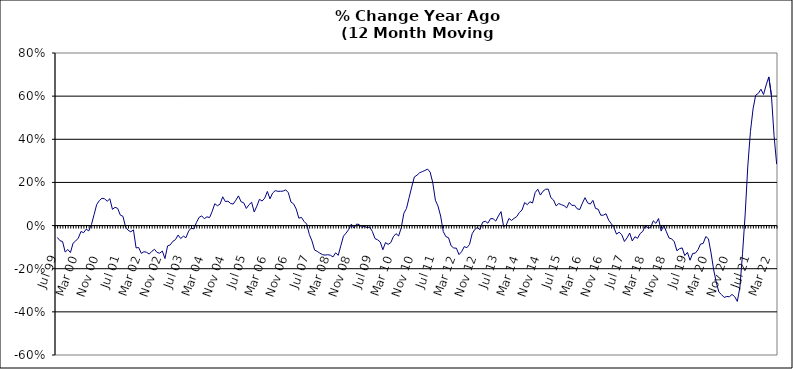
| Category | Series 0 |
|---|---|
| Jul 99 | -0.055 |
| Aug 99 | -0.07 |
| Sep 99 | -0.074 |
| Oct 99 | -0.123 |
| Nov 99 | -0.111 |
| Dec 99 | -0.125 |
| Jan 00 | -0.082 |
| Feb 00 | -0.071 |
| Mar 00 | -0.058 |
| Apr 00 | -0.027 |
| May 00 | -0.033 |
| Jun 00 | -0.017 |
| Jul 00 | -0.025 |
| Aug 00 | 0.005 |
| Sep 00 | 0.05 |
| Oct 00 | 0.098 |
| Nov 00 | 0.116 |
| Dec 00 | 0.127 |
| Jan 01 | 0.124 |
| Feb 01 | 0.113 |
| Mar 01 | 0.124 |
| Apr 01 | 0.075 |
| May 01 | 0.085 |
| Jun 01 | 0.08 |
| Jul 01 | 0.048 |
| Aug 01 | 0.043 |
| Sep 01 | -0.007 |
| Oct 01 | -0.022 |
| Nov 01 | -0.029 |
| Dec 01 | -0.02 |
| Jan 02 | -0.103 |
| Feb 02 | -0.102 |
| Mar 02 | -0.129 |
| Apr 02 | -0.121 |
| May 02 | -0.124 |
| Jun 02 | -0.132 |
| Jul 02 | -0.119 |
| Aug 02 | -0.11 |
| Sep 02 | -0.125 |
| Oct 02 | -0.128 |
| Nov 02 | -0.118 |
| Dec 02 | -0.153 |
| Jan 03 | -0.094 |
| Feb 03 | -0.09 |
| Mar 03 | -0.073 |
| Apr 03 | -0.065 |
| May 03 | -0.044 |
| Jun 03 | -0.06 |
| Jul 03 | -0.049 |
| Aug 03 | -0.056 |
| Sep 03 | -0.026 |
| Oct 03 | -0.012 |
| Nov 03 | -0.016 |
| Dec 03 | 0.014 |
| Jan 04 | 0.038 |
| Feb 04 | 0.045 |
| Mar 04 | 0.032 |
| Apr 04 | 0.041 |
| May 04 | 0.037 |
| Jun 04 | 0.066 |
| Jul 04 | 0.101 |
| Aug 04 | 0.092 |
| Sep 04 | 0.1 |
| Oct 04 | 0.133 |
| Nov 04 | 0.111 |
| Dec 04 | 0.113 |
| Jan 05 | 0.103 |
| Feb 05 | 0.1 |
| Mar 05 | 0.118 |
| Apr 05 | 0.138 |
| May 05 | 0.11 |
| Jun 05 | 0.106 |
| Jul 05 | 0.079 |
| Aug 05 | 0.097 |
| Sep 05 | 0.108 |
| Oct 05 | 0.063 |
| Nov 05 | 0.09 |
| Dec 05 | 0.122 |
| Jan 06 | 0.114 |
| Feb 06 | 0.127 |
| Mar 06 | 0.158 |
| Apr 06 | 0.124 |
| May 06 | 0.151 |
| Jun 06 | 0.162 |
| Jul 06 | 0.159 |
| Aug 06 | 0.159 |
| Sep 06 | 0.16 |
| Oct 06 | 0.166 |
| Nov 06 | 0.152 |
| Dec 06 | 0.109 |
| Jan 07 | 0.101 |
| Feb 07 | 0.076 |
| Mar 07 | 0.034 |
| Apr 07 | 0.038 |
| May 07 | 0.019 |
| Jun 07 | 0.007 |
| Jul 07 | -0.041 |
| Aug 07 | -0.071 |
| Sep 07 | -0.113 |
| Oct 07 | -0.12 |
| Nov 07 | -0.128 |
| Dec 07 | -0.135 |
| Jan 08 | -0.137 |
| Feb 08 | -0.135 |
| Mar 08 | -0.137 |
| Apr 08 | -0.145 |
| May 08 | -0.126 |
| Jun 08 | -0.138 |
| Jul 08 | -0.093 |
| Aug 08 | -0.049 |
| Sep-08 | -0.035 |
| Oct 08 | -0.018 |
| Nov 08 | 0.007 |
| Dec 08 | -0.011 |
| Jan 09 | 0.007 |
| Feb 09 | 0.005 |
| Mar 09 | -0.009 |
| Apr 09 | -0.003 |
| May 09 | -0.01 |
| Jun 09 | -0.007 |
| Jul 09 | -0.027 |
| Aug 09 | -0.06 |
| Sep 09 | -0.066 |
| Oct 09 | -0.076 |
| Nov 09 | -0.112 |
| Dec 09 | -0.079 |
| Jan 10 | -0.087 |
| Feb 10 | -0.079 |
| Mar 10 | -0.052 |
| Apr 10 | -0.037 |
| May 10 | -0.048 |
| Jun 10 | -0.01 |
| Jul 10 | 0.057 |
| Aug 10 | 0.08 |
| Sep 10 | 0.13 |
| Oct 10 | 0.179 |
| Nov 10 | 0.226 |
| Dec 10 | 0.233 |
| Jan 11 | 0.245 |
| Feb 11 | 0.25 |
| Mar 11 | 0.255 |
| Apr 11 | 0.262 |
| May 11 | 0.248 |
| Jun 11 | 0.199 |
| Jul 11 | 0.118 |
| Aug 11 | 0.09 |
| Sep 11 | 0.044 |
| Oct 11 | -0.028 |
| Nov 11 | -0.051 |
| Dec 11 | -0.056 |
| Jan 12 | -0.094 |
| Feb 12 | -0.104 |
| Mar 12 | -0.105 |
| Apr 12 | -0.134 |
| May 12 | -0.121 |
| Jun 12 | -0.098 |
| Jul 12 | -0.103 |
| Aug 12 | -0.087 |
| Sep 12 | -0.038 |
| Oct 12 | -0.018 |
| Nov 12 | -0.009 |
| Dec 12 | -0.019 |
| Jan 13 | 0.016 |
| Feb-13 | 0.02 |
| Mar-13 | 0.011 |
| Apr 13 | 0.032 |
| May 13 | 0.032 |
| Jun-13 | 0.021 |
| Jul 13 | 0.045 |
| Aug 13 | 0.065 |
| Sep 13 | -0.005 |
| Oct 13 | 0.002 |
| Nov 13 | 0.033 |
| Dec 13 | 0.024 |
| Jan 14 | 0.034 |
| Feb-14 | 0.042 |
| Mar 14 | 0.061 |
| Apr 14 | 0.072 |
| May 14 | 0.107 |
| Jun 14 | 0.097 |
| Jul-14 | 0.111 |
| Aug-14 | 0.105 |
| Sep 14 | 0.153 |
| Oct 14 | 0.169 |
| Nov 14 | 0.141 |
| Dec 14 | 0.159 |
| Jan 15 | 0.169 |
| Feb 15 | 0.169 |
| Mar 15 | 0.129 |
| Apr-15 | 0.118 |
| May 15 | 0.091 |
| Jun-15 | 0.102 |
| Jul 15 | 0.097 |
| Aug 15 | 0.092 |
| Sep 15 | 0.082 |
| Oct 15 | 0.108 |
| Nov 15 | 0.093 |
| Dec 15 | 0.094 |
| Jan 16 | 0.078 |
| Feb 16 | 0.075 |
| Mar 16 | 0.104 |
| Apr 16 | 0.129 |
| May 16 | 0.105 |
| Jun 16 | 0.1 |
| Jul 16 | 0.117 |
| Aug 16 | 0.08 |
| Sep 16 | 0.076 |
| Oct 16 | 0.048 |
| Nov 16 | 0.048 |
| Dec 16 | 0.055 |
| Jan 17 | 0.025 |
| Feb 17 | 0.009 |
| Mar 17 | -0.01 |
| Apr 17 | -0.04 |
| May 17 | -0.031 |
| Jun 17 | -0.042 |
| Jul 17 | -0.074 |
| Aug 17 | -0.057 |
| Sep 17 | -0.035 |
| Oct 17 | -0.071 |
| Nov 17 | -0.052 |
| Dec 17 | -0.059 |
| Jan 18 | -0.037 |
| Feb 18 | -0.027 |
| Mar 18 | 0 |
| Apr 18 | -0.012 |
| May 18 | -0.009 |
| Jun 18 | 0.022 |
| Jul 18 | 0.01 |
| Aug 18 | 0.033 |
| Sep 18 | -0.025 |
| Oct 18 | 0.002 |
| Nov 18 | -0.029 |
| Dec 18 | -0.058 |
| Jan 19 | -0.061 |
| Feb 19 | -0.075 |
| Mar 19 | -0.117 |
| Apr 19 | -0.107 |
| May 19 | -0.104 |
| Jun 19 | -0.139 |
| Jul 19 | -0.124 |
| Aug 19 | -0.16 |
| Sep 19 | -0.129 |
| Oct 19 | -0.128 |
| Nov 19 | -0.112 |
| Dec 19 | -0.085 |
| Jan 20 | -0.083 |
| Feb 20 | -0.051 |
| Mar 20 | -0.061 |
| Apr 20 | -0.127 |
| May 20 | -0.206 |
| Jun 20 | -0.264 |
| Jul 20 | -0.308 |
| Aug 20 | -0.32 |
| Sep 20 | -0.333 |
| Oct 20 | -0.329 |
| Nov 20 | -0.33 |
| Dec 20 | -0.319 |
| Jan 21 | -0.329 |
| Feb 21 | -0.352 |
| Mar 21 | -0.286 |
| Apr 21 | -0.129 |
| May 21 | 0.053 |
| Jun 21 | 0.276 |
| Jul 21 | 0.435 |
| Aug 21 | 0.541 |
| Sep 21 | 0.604 |
| Oct 21 | 0.613 |
| Nov 21 | 0.632 |
| Dec 21 | 0.608 |
| Jan 22 | 0.652 |
| Feb 22 | 0.689 |
| Mar 22 | 0.603 |
| Apr 22 | 0.416 |
| May 22 | 0.285 |